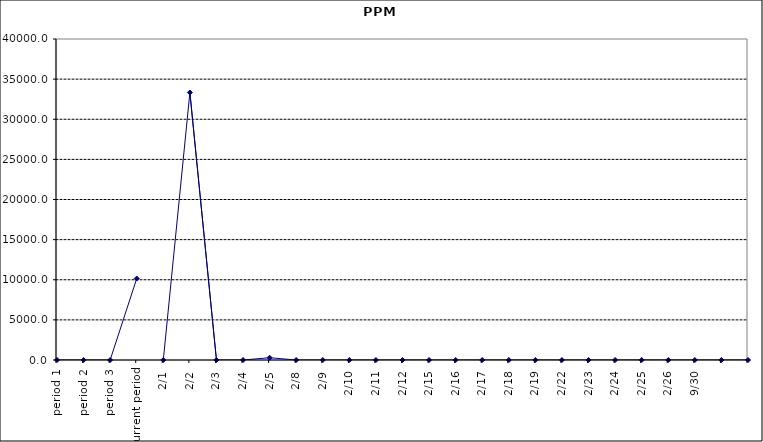
| Category | Series 0 |
|---|---|
| period 1 | 0 |
| period 2 | 0 |
| period 3 | 0 |
| current period | 10150.754 |
| 2/1 | 0 |
| 2/2 | 33333.333 |
| 2/3 | 0 |
| 2/4 | 0 |
| 2/5 | 285.714 |
| 2/8 | 0 |
| 2/9 | 0 |
| 2/10 | 0 |
| 2/11 | 0 |
| 2/12 | 0 |
| 2/15 | 0 |
| 2/16 | 0 |
| 2/17 | 0 |
| 2/18 | 0 |
| 2/19 | 0 |
| 2/22 | 0 |
| 2/23 | 0 |
| 2/24 | 0 |
| 2/25 | 0 |
| 2/26 | 0 |
| 9/30 | 0 |